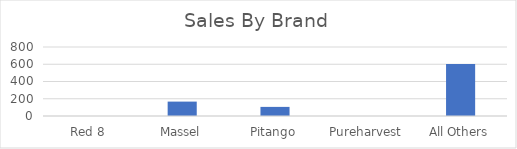
| Category | Series 0 |
|---|---|
| Red 8 | 0 |
| Massel | 166.9 |
| Pitango | 105.6 |
| Pureharvest | 0 |
| All Others | 602.22 |